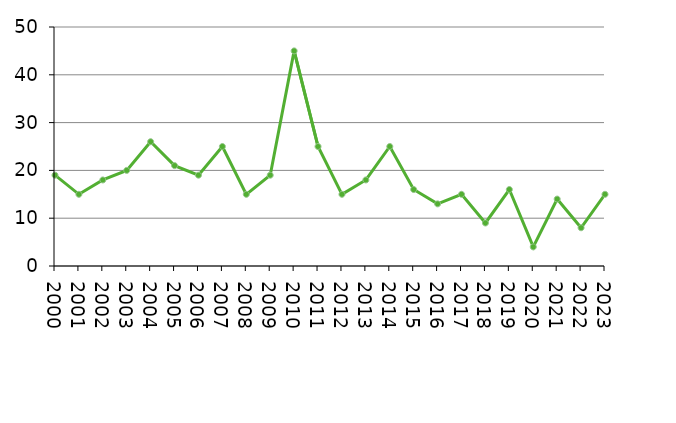
| Category | Avlidna |
|---|---|
| 2000 | 19 |
| 2001 | 15 |
| 2002 | 18 |
| 2003 | 20 |
| 2004 | 26 |
| 2005 | 21 |
| 2006 | 19 |
| 2007 | 25 |
| 2008 | 15 |
| 2009 | 19 |
| 2010 | 45 |
| 2011 | 25 |
| 2012 | 15 |
| 2013 | 18 |
| 2014 | 25 |
| 2015 | 16 |
| 2016 | 13 |
| 2017 | 15 |
| 2018 | 9 |
| 2019 | 16 |
| 2020 | 4 |
| 2021 | 14 |
| 2022 | 8 |
| 2023 | 15 |